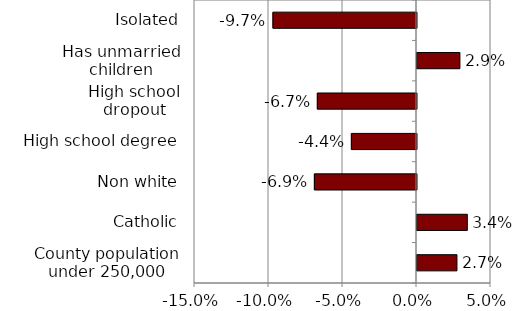
| Category | Series 0 |
|---|---|
| County population under 250,000 | 0.027 |
| Catholic | 0.034 |
| Non white | -0.069 |
| High school degree | -0.044 |
| High school dropout | -0.067 |
| Has unmarried children | 0.029 |
| Isolated | -0.097 |